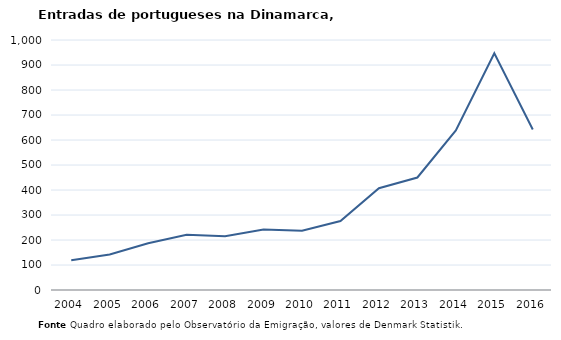
| Category | Entradas |
|---|---|
| 2004.0 | 119 |
| 2005.0 | 142 |
| 2006.0 | 187 |
| 2007.0 | 221 |
| 2008.0 | 215 |
| 2009.0 | 242 |
| 2010.0 | 237 |
| 2011.0 | 276 |
| 2012.0 | 407 |
| 2013.0 | 450 |
| 2014.0 | 638 |
| 2015.0 | 947 |
| 2016.0 | 642 |